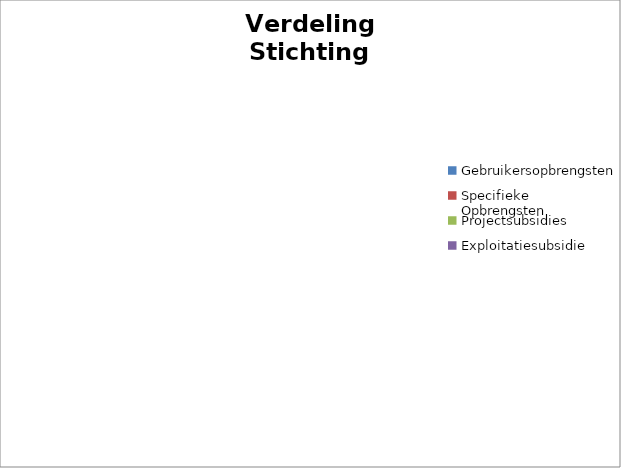
| Category | Totaal Stichting |
|---|---|
| Gebruikersopbrengsten | 0 |
| Specifieke Opbrengsten | 0 |
| Projectsubsidies | 0 |
| Exploitatiesubsidie | 0 |